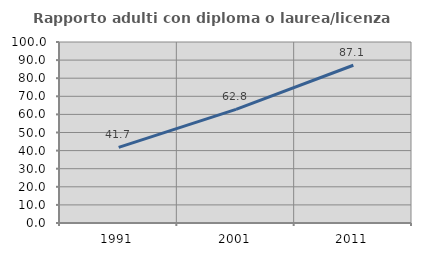
| Category | Rapporto adulti con diploma o laurea/licenza media  |
|---|---|
| 1991.0 | 41.742 |
| 2001.0 | 62.808 |
| 2011.0 | 87.15 |